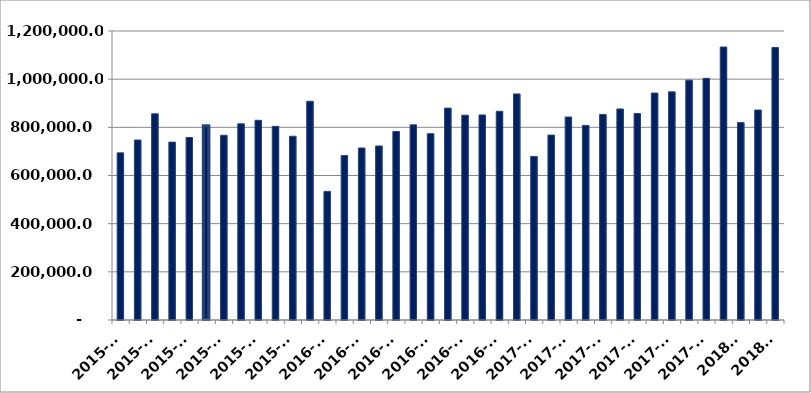
| Category | საქონლით საგარეო ვაჭრობა სულ |
|---|---|
| 2015-01 | 693965.077 |
| 2015-02 | 747293.051 |
| 2015-03 | 856080.098 |
| 2015-04 | 738613.701 |
| 2015-05 | 757878.712 |
| 2015-06 | 806119.876 |
| 2015-07 | 766955.517 |
| 2015-08 | 814646.294 |
| 2015-09 | 829173.575 |
| 2015-10 | 804043.002 |
| 2015-11 | 763102.176 |
| 2015-12 | 908092.939 |
| 2016-01 | 534063.371 |
| 2016-02 | 682998.151 |
| 2016-03 | 714259.49 |
| 2016-04 | 722513.461 |
| 2016-05 | 782805.836 |
| 2016-06 | 810296.193 |
| 2016-07 | 773647.372 |
| 2016-08 | 879835.97 |
| 2016-09 | 850597.611 |
| 2016-10 | 851493.027 |
| 2016-11 | 866668.983 |
| 2016-12 | 938736.746 |
| 2017-01 | 679232.869 |
| 2017-02 | 767893.86 |
| 2017-03 | 842676.087 |
| 2017-04 | 808010.098 |
| 2017-05 | 853533.974 |
| 2017-06 | 876280.688 |
| 2017-07 | 857256.002 |
| 2017-08 | 942318.449 |
| 2017-09 | 947275.546 |
| 2017-10 | 995833.568 |
| 2017-11 | 1003532.659 |
| 2017-12 | 1133562.659 |
| 2018-1 | 819768.983 |
| 2018-2 | 871917.326 |
| 2018-3 | 1131626.024 |